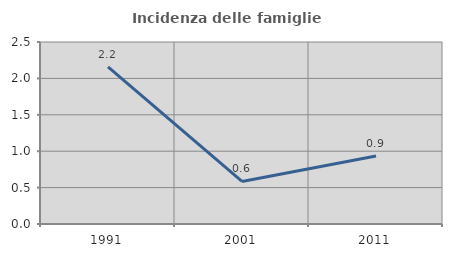
| Category | Incidenza delle famiglie numerose |
|---|---|
| 1991.0 | 2.158 |
| 2001.0 | 0.585 |
| 2011.0 | 0.935 |